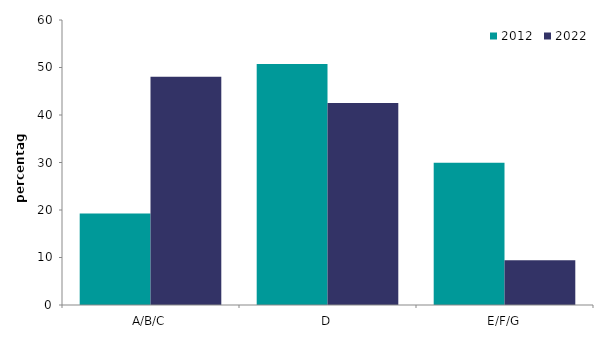
| Category | 2012 | 2022 |
|---|---|---|
| A/B/C | 19.269 | 48.028 |
| D | 50.759 | 42.551 |
| E/F/G | 29.972 | 9.421 |